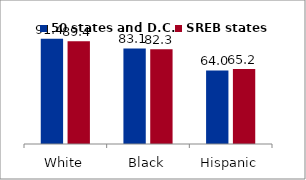
| Category | 50 states and D.C. | SREB states |
|---|---|---|
| White | 91.415 | 89.433 |
| Black | 83.099 | 82.347 |
| Hispanic | 63.951 | 65.15 |